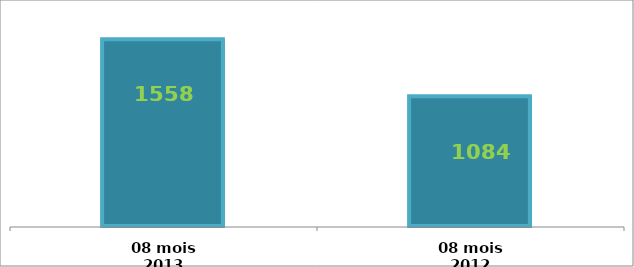
| Category | Series 0 |
|---|---|
| 08 mois 2013 | 1558.4 |
| 08 mois 2012 | 1083.9 |